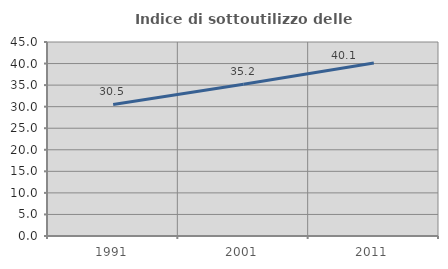
| Category | Indice di sottoutilizzo delle abitazioni  |
|---|---|
| 1991.0 | 30.526 |
| 2001.0 | 35.198 |
| 2011.0 | 40.15 |